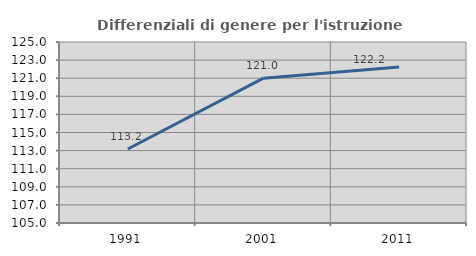
| Category | Differenziali di genere per l'istruzione superiore |
|---|---|
| 1991.0 | 113.174 |
| 2001.0 | 121.001 |
| 2011.0 | 122.244 |